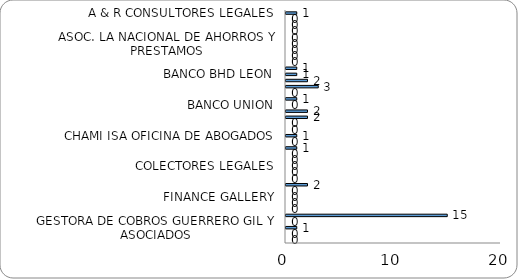
| Category | Series 0 |
|---|---|
| A & R CONSULTORES LEGALES | 1 |
| ALCANTARA BERAS & ASOCIADOS | 0 |
| ALTICE DOMINICANA, S.A. | 0 |
| ASC. POPULAR DE AHORROS Y PRESTAMOS | 0 |
| ASEREMIN | 0 |
| ASOC. LA NACIONAL DE AHORROS Y PRESTAMOS | 0 |
| ATEGIX COBROS LEGALES, S.R.L | 0 |
| AYUNTAMIENTO DEL DISTRITO NACIONAL, ADN | 0 |
| BALLISTA CONTRERAS & ASOCIADO | 0 |
| BANCO ADEMI | 1 |
| BANCO BHD LEON | 1 |
| BANCO CARIBE | 2 |
| BANCO POPULAR DOMINICANO | 3 |
| BANCO PROMERICA | 0 |
| BANCO SANTA CRUZ | 1 |
| BANCO UNION | 0 |
| BANESCO | 2 |
| BANRESERVAS | 2 |
| BAUGIL INVERSIONES Y PRÉSTAMOS, S.R.L. | 0 |
| CABRAL & DIAZ ASESORES LEGALES | 0 |
| CHAMI ISA OFICINA DE ABOGADOS | 1 |
| CLARO COMPANIA DOMINICANA DE TELEFONOS | 0 |
| COBEX. S.R.L. | 1 |
| COBROS LEGALES PEGUERO MATEO | 0 |
| COBROS NACIONALES | 0 |
| COLECTORES LEGALES | 0 |
| COOP-ASPIRE | 0 |
| CORPORACION DE CREDITO REIDCO | 0 |
| ESTUDIO LEGAL SOSA EVERTZ | 2 |
| FBGG SERVICIOS LEGALES | 0 |
| FINANCE GALLERY | 0 |
| FINANCIERA CREDICEFI | 0 |
| GESTIONADORA DE CREDITOS NOVANET | 0 |
| GESTIONADORA DE CRÉDITOS, S. A. | 15 |
| GESTIONES DE COBROS CORNIEL HEINSEN Y ASOC. SRL | 0 |
| GESTORA DE COBROS GUERRERO GIL Y ASOCIADOS | 1 |
| GUERRERO GIL Y ASOCIADOS | 0 |
| INVERSIONES 3R | 0 |